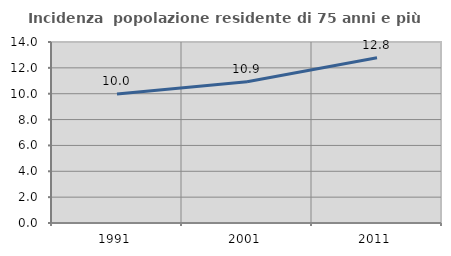
| Category | Incidenza  popolazione residente di 75 anni e più |
|---|---|
| 1991.0 | 9.974 |
| 2001.0 | 10.927 |
| 2011.0 | 12.775 |